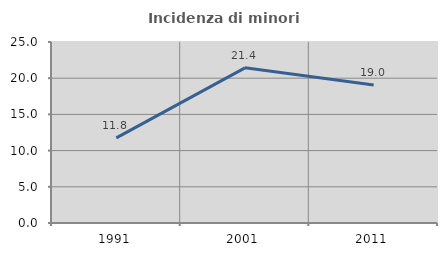
| Category | Incidenza di minori stranieri |
|---|---|
| 1991.0 | 11.765 |
| 2001.0 | 21.429 |
| 2011.0 | 19.048 |